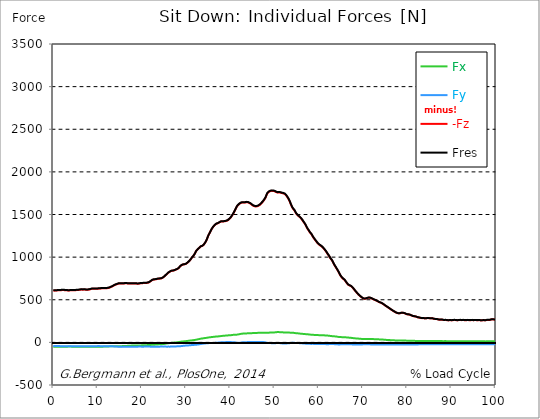
| Category |  Fx |  Fy |  -Fz |  Fres |
|---|---|---|---|---|
| 0.0 | -50.03 | -43.73 | 606.7 | 610.42 |
| 0.167348456675344 | -50.14 | -43.71 | 606.81 | 610.54 |
| 0.334696913350688 | -50.29 | -43.69 | 607.09 | 610.83 |
| 0.5020453700260321 | -50.26 | -43.76 | 607.5 | 611.24 |
| 0.669393826701376 | -50 | -43.91 | 607.67 | 611.4 |
| 0.83674228337672 | -50 | -43.82 | 608.8 | 612.51 |
| 1.0040907400520642 | -50.16 | -43.66 | 610.52 | 614.22 |
| 1.1621420602454444 | -50.29 | -43.71 | 611.02 | 614.73 |
| 1.3294905169207885 | -50.4 | -43.79 | 611.34 | 615.07 |
| 1.4968389735961325 | -50.25 | -43.98 | 611.24 | 614.97 |
| 1.6641874302714765 | -50.2 | -44.18 | 611.58 | 615.32 |
| 1.8315358869468206 | -50.31 | -44.32 | 612.5 | 616.26 |
| 1.9988843436221646 | -50.57 | -44.38 | 613.5 | 617.27 |
| 2.1662328002975086 | -50.65 | -44.38 | 613.83 | 617.61 |
| 2.333581256972853 | -50.66 | -44.45 | 613.87 | 617.65 |
| 2.5009297136481967 | -50.94 | -44.41 | 613.16 | 616.96 |
| 2.6682781703235405 | -50.64 | -44.63 | 610.94 | 614.74 |
| 2.8356266269988843 | -50.2 | -44.5 | 610.81 | 614.57 |
| 3.002975083674229 | -50.25 | -44.3 | 610.69 | 614.44 |
| 3.1703235403495724 | -50.28 | -44.38 | 609.22 | 612.99 |
| 3.337671997024917 | -49.77 | -44.44 | 608.58 | 612.32 |
| 3.4957233172182973 | -49.54 | -44.42 | 608.79 | 612.5 |
| 3.663071773893641 | -49.49 | -44.37 | 609.25 | 612.95 |
| 3.8304202305689854 | -49.52 | -44.34 | 610.05 | 613.75 |
| 3.997768687244329 | -49.82 | -44.34 | 611.59 | 615.3 |
| 4.165117143919673 | -50.29 | -44.34 | 611.83 | 615.57 |
| 4.332465600595017 | -50.3 | -44.55 | 611.91 | 615.67 |
| 4.499814057270361 | -50.46 | -44.6 | 612.08 | 615.85 |
| 4.667162513945706 | -50.46 | -44.63 | 611.01 | 614.8 |
| 4.834510970621049 | -50.18 | -44.73 | 610.04 | 613.82 |
| 5.001859427296393 | -50 | -44.64 | 611.25 | 615 |
| 5.169207883971737 | -50.35 | -44.39 | 613.1 | 616.84 |
| 5.336556340647081 | -50.72 | -44.33 | 614.27 | 618.04 |
| 5.503904797322425 | -51.13 | -44.53 | 614.47 | 618.28 |
| 5.671253253997769 | -50.86 | -44.63 | 614.72 | 618.51 |
| 5.82930457419115 | -50.81 | -44.65 | 615.88 | 619.66 |
| 5.996653030866494 | -50.98 | -44.63 | 617.39 | 621.17 |
| 6.164001487541838 | -51.19 | -44.56 | 618.68 | 622.47 |
| 6.331349944217181 | -51.36 | -44.56 | 619.37 | 623.17 |
| 6.498698400892526 | -51.21 | -44.72 | 619.13 | 622.93 |
| 6.66604685756787 | -50.77 | -45.04 | 618.05 | 621.85 |
| 6.833395314243213 | -50.56 | -45.03 | 619.19 | 622.96 |
| 7.000743770918558 | -51.36 | -44.94 | 619.77 | 623.6 |
| 7.168092227593902 | -51.63 | -44.89 | 618.61 | 622.46 |
| 7.335440684269246 | -51.53 | -44.88 | 617.51 | 621.37 |
| 7.50278914094459 | -51.17 | -44.82 | 616.87 | 620.69 |
| 7.6701375976199335 | -51.35 | -44.64 | 616.97 | 620.78 |
| 7.837486054295278 | -51.47 | -44.79 | 617.33 | 621.16 |
| 7.995537374488658 | -51.59 | -44.84 | 618.77 | 622.61 |
| 8.162885831164003 | -52.3 | -44.68 | 621.01 | 624.88 |
| 8.330234287839346 | -52.4 | -44.66 | 622.7 | 626.57 |
| 8.49758274451469 | -52.33 | -44.54 | 624.35 | 628.2 |
| 8.664931201190035 | -52.21 | -44.27 | 627.65 | 631.45 |
| 8.832279657865378 | -52.04 | -44.27 | 628.22 | 631.99 |
| 8.999628114540721 | -51.46 | -44.2 | 628.36 | 632.09 |
| 9.166976571216066 | -51.82 | -44.13 | 629.01 | 632.76 |
| 9.334325027891412 | -51.57 | -44.18 | 628.21 | 631.95 |
| 9.501673484566755 | -51.21 | -44.17 | 628.23 | 631.94 |
| 9.669021941242098 | -51.06 | -44.13 | 628.77 | 632.47 |
| 9.836370397917442 | -51.72 | -43.76 | 630.57 | 634.29 |
| 10.003718854592787 | -51.32 | -43.96 | 629.32 | 633.03 |
| 10.17106731126813 | -50.98 | -43.87 | 630 | 633.68 |
| 10.329118631461512 | -50.83 | -43.89 | 631.03 | 634.69 |
| 10.496467088136853 | -51.18 | -43.97 | 632.4 | 636.1 |
| 10.663815544812199 | -50.75 | -44.24 | 632.56 | 636.25 |
| 10.831164001487544 | -50.8 | -44.48 | 633.72 | 637.43 |
| 10.998512458162887 | -50.89 | -44.59 | 634.09 | 637.82 |
| 11.16586091483823 | -50.25 | -44.62 | 634.28 | 637.95 |
| 11.333209371513574 | -49.75 | -44.71 | 633.45 | 637.1 |
| 11.50055782818892 | -48.91 | -44.7 | 633.4 | 637 |
| 11.667906284864264 | -48.38 | -44.69 | 633.43 | 636.99 |
| 11.835254741539607 | -47.92 | -44.75 | 633.3 | 636.83 |
| 12.00260319821495 | -47.85 | -44.9 | 634.76 | 638.31 |
| 12.169951654890292 | -47.43 | -45.13 | 635.64 | 639.16 |
| 12.337300111565641 | -47.79 | -45.23 | 637.43 | 640.98 |
| 12.504648568240984 | -47.06 | -45.49 | 638.25 | 641.77 |
| 12.662699888434362 | -46.84 | -45.68 | 641.33 | 644.84 |
| 12.830048345109708 | -46.6 | -45.93 | 644.88 | 648.39 |
| 12.997396801785053 | -46.11 | -46.07 | 649.49 | 652.97 |
| 13.164745258460396 | -46.09 | -46.11 | 653.83 | 657.31 |
| 13.33209371513574 | -45.84 | -46.42 | 656.97 | 660.46 |
| 13.499442171811083 | -45.76 | -46.72 | 661.44 | 664.94 |
| 13.666790628486426 | -46.01 | -47.05 | 667.28 | 670.81 |
| 13.834139085161771 | -45.85 | -47.48 | 672.17 | 675.71 |
| 14.001487541837117 | -45.58 | -47.71 | 675.96 | 679.5 |
| 14.16883599851246 | -45.53 | -48.23 | 679 | 682.55 |
| 14.336184455187803 | -45.29 | -49.05 | 681.45 | 685.01 |
| 14.503532911863147 | -45.06 | -49.79 | 684.89 | 688.46 |
| 14.670881368538492 | -44.8 | -50.48 | 688.56 | 692.15 |
| 14.828932688731873 | -44.61 | -50.66 | 690.56 | 694.14 |
| 14.996281145407215 | -44.37 | -50.83 | 690.69 | 694.26 |
| 15.163629602082558 | -43.97 | -50.82 | 690.68 | 694.22 |
| 15.330978058757903 | -44.33 | -50.81 | 691.21 | 694.78 |
| 15.498326515433247 | -44.28 | -50.85 | 691.18 | 694.76 |
| 15.665674972108594 | -43.83 | -51.06 | 690.93 | 694.5 |
| 15.833023428783937 | -43.39 | -51.31 | 690.98 | 694.54 |
| 16.00037188545928 | -42.86 | -51.4 | 691.07 | 694.6 |
| 16.167720342134626 | -42.68 | -51.51 | 692.37 | 695.89 |
| 16.335068798809967 | -42.73 | -51.37 | 693.41 | 696.91 |
| 16.502417255485312 | -42.02 | -51.28 | 692.83 | 696.28 |
| 16.669765712160658 | -41.21 | -51.13 | 691.95 | 695.34 |
| 16.837114168836 | -40.26 | -50.86 | 690.62 | 693.95 |
| 17.004462625511344 | -39.67 | -50.69 | 689.55 | 692.84 |
| 17.16251394570472 | -39.1 | -50.52 | 688.62 | 691.88 |
| 17.32986240238007 | -38.62 | -50.21 | 689.46 | 692.68 |
| 17.497210859055414 | -38.38 | -50.07 | 689.43 | 692.65 |
| 17.664559315730756 | -38.1 | -50.08 | 689.35 | 692.55 |
| 17.8319077724061 | -38.3 | -50.09 | 690.65 | 693.87 |
| 17.999256229081443 | -38.13 | -50.06 | 691.11 | 694.32 |
| 18.166604685756788 | -37.95 | -49.92 | 691.1 | 694.3 |
| 18.333953142432133 | -37.44 | -49.96 | 690.66 | 693.84 |
| 18.501301599107478 | -37.17 | -50.11 | 690.75 | 693.92 |
| 18.668650055782823 | -37.32 | -49.99 | 690.06 | 693.25 |
| 18.835998512458165 | -36.9 | -50.12 | 688.65 | 691.83 |
| 19.00334696913351 | -36.75 | -50.07 | 688.29 | 691.46 |
| 19.170695425808855 | -36.61 | -50 | 688.05 | 691.21 |
| 19.338043882484197 | -36.16 | -49.74 | 689.17 | 692.29 |
| 19.496095202677576 | -35.95 | -49.45 | 690.96 | 694.05 |
| 19.66344365935292 | -35.72 | -49.39 | 692.54 | 695.62 |
| 19.830792116028263 | -35.12 | -49.92 | 692.88 | 695.96 |
| 19.998140572703612 | -34.98 | -50.15 | 694.28 | 697.35 |
| 20.165489029378953 | -34.74 | -50.04 | 695.34 | 698.4 |
| 20.3328374860543 | -34.53 | -49.96 | 695.11 | 698.15 |
| 20.500185942729644 | -34.13 | -49.87 | 694.75 | 697.77 |
| 20.667534399404985 | -33.5 | -49.74 | 694.98 | 697.95 |
| 20.83488285608033 | -32.97 | -49.7 | 696.65 | 699.6 |
| 21.002231312755672 | -32.68 | -49.73 | 696.59 | 699.54 |
| 21.16957976943102 | -32.07 | -49.63 | 697.96 | 700.86 |
| 21.336928226106362 | -31.84 | -49.48 | 699.69 | 702.57 |
| 21.504276682781704 | -31.51 | -49.44 | 701.53 | 704.39 |
| 21.67162513945705 | -31.05 | -49.57 | 705.58 | 708.41 |
| 21.82967645965043 | -30.59 | -49.63 | 710.68 | 713.48 |
| 21.997024916325774 | -29.94 | -50.21 | 718.14 | 720.92 |
| 22.16437337300112 | -29.32 | -50.72 | 725.43 | 728.2 |
| 22.33172182967646 | -28.55 | -50.78 | 730.93 | 733.67 |
| 22.499070286351806 | -27.82 | -50.57 | 734.25 | 736.95 |
| 22.666418743027148 | -27.14 | -50.49 | 736.87 | 739.53 |
| 22.833767199702496 | -26.76 | -50.59 | 738.41 | 741.05 |
| 23.00111565637784 | -26.46 | -50.6 | 739.01 | 741.62 |
| 23.168464113053183 | -25.8 | -50.65 | 739.18 | 741.75 |
| 23.335812569728528 | -25.26 | -50.63 | 741.61 | 744.15 |
| 23.50316102640387 | -24.48 | -50.53 | 745.12 | 747.62 |
| 23.670509483079215 | -23.78 | -50.4 | 747.04 | 749.5 |
| 23.83785793975456 | -23.07 | -50.35 | 748.05 | 750.47 |
| 23.995909259947936 | -22.47 | -50.1 | 748.03 | 750.39 |
| 24.163257716623285 | -22.05 | -49.56 | 747.69 | 749.99 |
| 24.330606173298627 | -21.54 | -49.38 | 749.4 | 751.67 |
| 24.49795462997397 | -20.86 | -49.14 | 752.52 | 754.76 |
| 24.665303086649313 | -20.34 | -49.5 | 757.07 | 759.31 |
| 24.83265154332466 | -19.49 | -49.79 | 762.71 | 764.95 |
| 25.0 | -18.4 | -49.91 | 768.77 | 770.98 |
| 25.167348456675345 | -16.95 | -49.71 | 776.84 | 779.03 |
| 25.334696913350694 | -15.35 | -49.36 | 785.76 | 787.93 |
| 25.502045370026035 | -14.36 | -49.82 | 793.87 | 796.05 |
| 25.669393826701377 | -12.76 | -50.24 | 801.05 | 803.24 |
| 25.836742283376722 | -11.12 | -49.69 | 809.87 | 812.06 |
| 26.004090740052067 | -10.08 | -49.69 | 817.6 | 819.8 |
| 26.17143919672741 | -9.38 | -50.09 | 823.62 | 825.83 |
| 26.329490516920792 | -8.33 | -50.05 | 828.77 | 830.96 |
| 26.49683897359613 | -7.05 | -49.66 | 834.05 | 836.21 |
| 26.66418743027148 | -5.98 | -49.2 | 838.92 | 841.07 |
| 26.831535886946828 | -5.4 | -49.2 | 839.9 | 842.02 |
| 26.998884343622166 | -4.6 | -48.91 | 840.66 | 842.72 |
| 27.166232800297514 | -3.75 | -48.61 | 841.61 | 843.62 |
| 27.333581256972852 | -2.51 | -47.91 | 845.4 | 847.37 |
| 27.5009297136482 | -1.61 | -47.61 | 849.03 | 850.97 |
| 27.668278170323543 | -0.83 | -47.37 | 852.81 | 854.72 |
| 27.835626626998888 | -0.17 | -47.35 | 856.7 | 858.59 |
| 28.002975083674233 | 0.77 | -46.47 | 860.36 | 862.19 |
| 28.170323540349575 | 1.85 | -45.81 | 864.91 | 866.69 |
| 28.33767199702492 | 3.05 | -44.99 | 871.39 | 873.12 |
| 28.50502045370026 | 4.9 | -44.93 | 883.01 | 884.76 |
| 28.663071773893645 | 6.69 | -45.29 | 892.73 | 894.53 |
| 28.830420230568986 | 8.22 | -44.26 | 900.25 | 902.05 |
| 28.99776868724433 | 9.47 | -42.87 | 906.32 | 908.1 |
| 29.165117143919673 | 10.29 | -41.83 | 910 | 911.74 |
| 29.33246560059502 | 11.11 | -40.8 | 913.54 | 915.23 |
| 29.499814057270367 | 11.94 | -39.96 | 915.54 | 917.21 |
| 29.66716251394571 | 12.93 | -39.09 | 916.25 | 917.89 |
| 29.834510970621054 | 14.06 | -37.9 | 917.73 | 919.32 |
| 30.00185942729639 | 14.99 | -37.08 | 922.27 | 923.82 |
| 30.169207883971744 | 16.03 | -36.43 | 928.11 | 929.66 |
| 30.33655634064708 | 17.24 | -36.08 | 935.2 | 936.75 |
| 30.50390479732243 | 18.4 | -35.56 | 942.12 | 943.66 |
| 30.671253253997772 | 19.41 | -35.08 | 950.84 | 952.37 |
| 30.829304574191156 | 20.87 | -33.97 | 959.71 | 961.21 |
| 30.996653030866494 | 21.99 | -32.74 | 970.44 | 971.91 |
| 31.164001487541842 | 22.64 | -32.25 | 983.08 | 984.54 |
| 31.331349944217187 | 23.64 | -31.68 | 995.01 | 996.44 |
| 31.498698400892525 | 24.94 | -31.19 | 1005.84 | 1007.24 |
| 31.666046857567874 | 25.91 | -30.09 | 1014.98 | 1016.32 |
| 31.833395314243212 | 27.01 | -29.1 | 1025.86 | 1027.15 |
| 32.00074377091856 | 28.48 | -28.49 | 1041.4 | 1042.69 |
| 32.1680922275939 | 30.18 | -27.96 | 1059.26 | 1060.59 |
| 32.33544068426925 | 31.85 | -27.06 | 1074.95 | 1076.31 |
| 32.50278914094459 | 33.51 | -25.9 | 1085.31 | 1086.65 |
| 32.670137597619934 | 35.58 | -24.96 | 1093.42 | 1094.75 |
| 32.83748605429528 | 37.87 | -24.48 | 1101.66 | 1103.01 |
| 33.004834510970625 | 39.69 | -22.5 | 1109.67 | 1110.98 |
| 33.162885831164004 | 41.44 | -20.27 | 1117.64 | 1118.91 |
| 33.33023428783935 | 43.37 | -19.17 | 1126.08 | 1127.36 |
| 33.497582744514695 | 44.7 | -17.82 | 1129.32 | 1130.64 |
| 33.664931201190036 | 45.88 | -16.27 | 1132.04 | 1133.38 |
| 33.83227965786538 | 47.24 | -14.88 | 1136.57 | 1137.96 |
| 33.99962811454073 | 48.73 | -14.39 | 1145.59 | 1147.06 |
| 34.16697657121607 | 49.96 | -13.6 | 1158.16 | 1159.67 |
| 34.33432502789141 | 51.27 | -12.25 | 1170.76 | 1172.28 |
| 34.50167348456676 | 52.45 | -11.24 | 1185.78 | 1187.31 |
| 34.6690219412421 | 53.47 | -10.48 | 1203.43 | 1204.98 |
| 34.83637039791744 | 54.89 | -9.75 | 1225.67 | 1227.27 |
| 35.00371885459279 | 56.7 | -9.27 | 1248.28 | 1249.94 |
| 35.17106731126814 | 58.15 | -8.69 | 1265.86 | 1267.54 |
| 35.338415767943474 | 59.25 | -8.21 | 1282.45 | 1284.16 |
| 35.49646708813686 | 60.4 | -8.12 | 1299.5 | 1301.25 |
| 35.6638155448122 | 61.6 | -8.29 | 1316.74 | 1318.53 |
| 35.831164001487544 | 62.29 | -8.17 | 1332.68 | 1334.48 |
| 35.998512458162885 | 63.43 | -7.93 | 1345.62 | 1347.48 |
| 36.165860914838234 | 64.66 | -7.29 | 1357.4 | 1359.3 |
| 36.333209371513576 | 65.71 | -6.92 | 1367.85 | 1369.8 |
| 36.50055782818892 | 67.04 | -6.21 | 1376.92 | 1378.94 |
| 36.667906284864266 | 67.66 | -5.39 | 1384.26 | 1386.31 |
| 36.83525474153961 | 68.19 | -4.48 | 1390.79 | 1392.86 |
| 37.002603198214956 | 68.89 | -3.69 | 1394.28 | 1396.4 |
| 37.1699516548903 | 69.73 | -3.03 | 1396.84 | 1399.01 |
| 37.337300111565646 | 70.47 | -2.4 | 1400.95 | 1403.16 |
| 37.50464856824098 | 71.39 | -1.71 | 1406.62 | 1408.88 |
| 37.66269988843437 | 72.5 | -0.87 | 1412.49 | 1414.82 |
| 37.83004834510971 | 73.63 | -0.05 | 1416.71 | 1419.12 |
| 37.99739680178505 | 74.76 | 0.76 | 1419.02 | 1421.51 |
| 38.16474525846039 | 75.78 | 1.5 | 1419.33 | 1421.9 |
| 38.33209371513574 | 76.7 | 1.75 | 1419.24 | 1421.88 |
| 38.49944217181109 | 77.62 | 2.01 | 1419.15 | 1421.86 |
| 38.666790628486424 | 78.35 | 2.26 | 1420.67 | 1423.44 |
| 38.83413908516178 | 79.09 | 2.75 | 1421.81 | 1424.64 |
| 39.001487541837115 | 79.86 | 3.19 | 1423.38 | 1426.28 |
| 39.16883599851246 | 80.73 | 3.45 | 1426.29 | 1429.25 |
| 39.336184455187805 | 81.58 | 3.75 | 1429.42 | 1432.45 |
| 39.503532911863154 | 82.12 | 3.79 | 1434.83 | 1437.91 |
| 39.670881368538495 | 82.54 | 3.6 | 1442.44 | 1445.55 |
| 39.83822982521384 | 83.14 | 3.8 | 1450.51 | 1453.67 |
| 39.996281145407224 | 83.67 | 3.78 | 1458.89 | 1462.09 |
| 40.163629602082565 | 84.41 | 3.52 | 1469.05 | 1472.3 |
| 40.33097805875791 | 85.53 | 2.81 | 1482.54 | 1485.86 |
| 40.498326515433256 | 86.98 | 2.87 | 1496.13 | 1499.52 |
| 40.6656749721086 | 88.43 | 2.24 | 1509.4 | 1512.86 |
| 40.83302342878393 | 88.67 | 1.19 | 1525.85 | 1529.31 |
| 41.00037188545929 | 89.02 | -0.08 | 1541.85 | 1545.32 |
| 41.16772034213463 | 89.33 | -1.76 | 1558.95 | 1562.45 |
| 41.33506879880997 | 89.72 | -3.58 | 1576.72 | 1580.25 |
| 41.50241725548531 | 90.83 | -5.14 | 1593.8 | 1597.38 |
| 41.66976571216066 | 91.65 | -5.57 | 1605.57 | 1609.18 |
| 41.837114168836 | 93.46 | -5.3 | 1614.19 | 1617.94 |
| 42.004462625511344 | 95.38 | -5.16 | 1622.28 | 1626.18 |
| 42.17181108218669 | 97.44 | -4.64 | 1628.85 | 1632.92 |
| 42.32986240238007 | 99.37 | -3.59 | 1634.57 | 1638.8 |
| 42.497210859055414 | 100.63 | -1.89 | 1638.27 | 1642.59 |
| 42.66455931573076 | 101.62 | -0.33 | 1640.05 | 1644.5 |
| 42.831907772406105 | 103.46 | 0.26 | 1640.85 | 1645.53 |
| 42.999256229081446 | 104.35 | 1.8 | 1639.27 | 1644.07 |
| 43.16660468575679 | 104.73 | 2.94 | 1638.53 | 1643.38 |
| 43.33395314243214 | 105.08 | 2.6 | 1639.78 | 1644.65 |
| 43.50130159910748 | 105.17 | 2.73 | 1641.9 | 1646.73 |
| 43.66865005578282 | 105.24 | 2.75 | 1643.57 | 1648.38 |
| 43.83599851245817 | 105.47 | 2.75 | 1643.81 | 1648.63 |
| 44.00334696913351 | 106.17 | 3.27 | 1642.14 | 1647.03 |
| 44.17069542580886 | 107.15 | 3.98 | 1638.64 | 1643.61 |
| 44.3380438824842 | 107.86 | 3.68 | 1633.98 | 1638.98 |
| 44.49609520267758 | 107.42 | 3.39 | 1629.16 | 1634.08 |
| 44.66344365935292 | 106.77 | 3.21 | 1623.97 | 1628.82 |
| 44.83079211602827 | 107.65 | 2.78 | 1617.17 | 1622.13 |
| 44.99814057270361 | 108.64 | 3.54 | 1609.21 | 1614.24 |
| 45.16548902937895 | 109.27 | 4.2 | 1603.08 | 1608.15 |
| 45.332837486054295 | 109.8 | 4.52 | 1599.13 | 1604.25 |
| 45.500185942729644 | 110.77 | 4.02 | 1596.1 | 1601.31 |
| 45.66753439940499 | 111.19 | 3.44 | 1594.51 | 1599.76 |
| 45.83488285608033 | 111.15 | 3.6 | 1594.36 | 1599.63 |
| 46.00223131275568 | 111 | 4.14 | 1595.45 | 1600.73 |
| 46.16957976943102 | 111.18 | 4.74 | 1598.06 | 1603.36 |
| 46.336928226106366 | 111.79 | 5.26 | 1601.63 | 1606.99 |
| 46.50427668278171 | 112.29 | 5.78 | 1606.19 | 1611.61 |
| 46.671625139457056 | 111.87 | 5.44 | 1612.73 | 1618.09 |
| 46.829676459650436 | 112.17 | 5.38 | 1621.03 | 1626.38 |
| 46.99702491632577 | 112.61 | 5.35 | 1629.68 | 1635.05 |
| 47.16437337300112 | 113.35 | 5.17 | 1639.35 | 1644.74 |
| 47.33172182967646 | 112.84 | 4.47 | 1648.5 | 1653.77 |
| 47.49907028635181 | 112.26 | 3.29 | 1660.13 | 1665.27 |
| 47.66641874302716 | 111.97 | 2.19 | 1671.35 | 1676.42 |
| 47.83376719970249 | 111.81 | 1.63 | 1682.35 | 1687.36 |
| 48.001115656377834 | 111.63 | -0.49 | 1700.26 | 1705.22 |
| 48.16846411305319 | 111.44 | -3.31 | 1723.63 | 1728.52 |
| 48.33581256972853 | 112.23 | -5.26 | 1744.91 | 1749.81 |
| 48.50316102640387 | 113.26 | -6.45 | 1756.04 | 1760.96 |
| 48.67050948307921 | 113.65 | -7.06 | 1763.65 | 1768.57 |
| 48.837857939754564 | 114.2 | -7.44 | 1769.75 | 1774.7 |
| 49.005206396429905 | 114.98 | -7.82 | 1773.27 | 1778.24 |
| 49.163257716623285 | 115.24 | -8.56 | 1775.87 | 1780.87 |
| 49.33060617329863 | 115.68 | -9.44 | 1777.49 | 1782.54 |
| 49.49795462997397 | 116.32 | -10.38 | 1777.96 | 1783.08 |
| 49.66530308664932 | 116.99 | -10.94 | 1776.62 | 1781.79 |
| 49.832651543324666 | 116.96 | -11.48 | 1775.39 | 1780.55 |
| 50.0 | 116.81 | -11.54 | 1773.54 | 1778.69 |
| 50.16734845667534 | 118.2 | -9.93 | 1769.42 | 1774.66 |
| 50.33469691335069 | 119.22 | -8.93 | 1764.3 | 1769.62 |
| 50.50204537002604 | 120.25 | -7.92 | 1759.19 | 1764.58 |
| 50.66939382670139 | 120.78 | -6.58 | 1756.81 | 1762.22 |
| 50.836742283376715 | 120.67 | -7.17 | 1757.65 | 1763.03 |
| 51.00409074005207 | 120.54 | -7.82 | 1758.58 | 1763.94 |
| 51.17143919672741 | 120.34 | -8.91 | 1758.78 | 1764.12 |
| 51.32949051692079 | 119.38 | -9.49 | 1756.77 | 1762.05 |
| 51.496838973596134 | 116.75 | -9.51 | 1754.49 | 1759.58 |
| 51.66418743027148 | 117.54 | -11.8 | 1751 | 1756.17 |
| 51.831535886946824 | 117.79 | -13.32 | 1748.8 | 1754.02 |
| 51.99888434362217 | 117.22 | -13.24 | 1747.92 | 1753.09 |
| 52.16623280029752 | 116.66 | -13.03 | 1746.93 | 1752.06 |
| 52.33358125697285 | 116.46 | -13.25 | 1740.69 | 1745.82 |
| 52.5009297136482 | 116.14 | -13.16 | 1732.3 | 1737.43 |
| 52.668278170323546 | 116.18 | -12.38 | 1722.2 | 1727.35 |
| 52.835626626998895 | 116.16 | -11.88 | 1709.86 | 1715.02 |
| 53.00297508367424 | 115.88 | -11.44 | 1696.61 | 1701.78 |
| 53.17032354034958 | 115.37 | -11.06 | 1682.2 | 1687.37 |
| 53.33767199702492 | 114.9 | -10.19 | 1665.33 | 1670.51 |
| 53.50502045370027 | 114.54 | -8.45 | 1645.6 | 1650.77 |
| 53.663071773893655 | 113.51 | -7.15 | 1622.96 | 1628.07 |
| 53.83042023056899 | 112.45 | -6.52 | 1603.07 | 1608.12 |
| 53.99776868724433 | 112.45 | -5.09 | 1584.61 | 1589.69 |
| 54.16511714391967 | 112.43 | -4.3 | 1569.45 | 1574.58 |
| 54.33246560059503 | 111.67 | -4.96 | 1559.01 | 1564.12 |
| 54.49981405727037 | 110.31 | -5.56 | 1549.12 | 1554.15 |
| 54.667162513945705 | 108.91 | -5.95 | 1533.26 | 1538.23 |
| 54.834510970621054 | 107.57 | -6.38 | 1517.52 | 1522.43 |
| 55.0018594272964 | 106.9 | -7.15 | 1504.55 | 1509.43 |
| 55.169207883971744 | 106.69 | -7.42 | 1494.29 | 1499.17 |
| 55.336556340647086 | 105.88 | -8.02 | 1486.26 | 1491.08 |
| 55.50390479732243 | 104.74 | -8.59 | 1479.2 | 1483.92 |
| 55.671253253997776 | 103.59 | -9.15 | 1472.15 | 1476.76 |
| 55.83860171067312 | 102.5 | -9.79 | 1464.1 | 1468.62 |
| 55.9966530308665 | 101.46 | -10.54 | 1454.81 | 1459.27 |
| 56.16400148754184 | 100.59 | -11.26 | 1444.51 | 1448.92 |
| 56.33134994421718 | 99.89 | -11.86 | 1431.91 | 1436.32 |
| 56.498698400892536 | 99.27 | -12.38 | 1418.54 | 1422.93 |
| 56.66604685756788 | 98.75 | -13.44 | 1406.91 | 1411.29 |
| 56.83339531424321 | 97.81 | -14.13 | 1393.66 | 1398.03 |
| 57.00074377091856 | 96.84 | -14.88 | 1379.58 | 1383.92 |
| 57.16809222759391 | 96.03 | -15.24 | 1361.93 | 1366.27 |
| 57.33544068426925 | 95.24 | -15.18 | 1344.84 | 1349.17 |
| 57.5027891409446 | 94.42 | -15.45 | 1329.82 | 1334.14 |
| 57.670137597619934 | 93.75 | -16.11 | 1319.19 | 1323.49 |
| 57.83748605429528 | 92.46 | -16.51 | 1304.48 | 1308.72 |
| 58.004834510970625 | 91.16 | -17.5 | 1290.21 | 1294.41 |
| 58.16288583116401 | 90.8 | -17.56 | 1278.61 | 1282.83 |
| 58.330234287839346 | 90.39 | -17.78 | 1269.89 | 1274.1 |
| 58.497582744514695 | 89.68 | -17.44 | 1256.41 | 1260.6 |
| 58.66493120119004 | 88.69 | -17.42 | 1240.05 | 1244.21 |
| 58.832279657865385 | 88.01 | -17.97 | 1226.93 | 1231.09 |
| 58.999628114540734 | 87.48 | -18.36 | 1215.01 | 1219.19 |
| 59.16697657121607 | 86.97 | -18.43 | 1203.13 | 1207.33 |
| 59.33432502789142 | 86.7 | -18.32 | 1192.29 | 1196.52 |
| 59.50167348456676 | 86.2 | -18.76 | 1180.57 | 1184.82 |
| 59.66902194124211 | 85.67 | -19.4 | 1168.41 | 1172.67 |
| 59.83637039791745 | 85.38 | -19.55 | 1159.39 | 1163.67 |
| 60.00371885459278 | 84.86 | -19.54 | 1150.76 | 1155.04 |
| 60.17106731126813 | 84.62 | -19.99 | 1143.6 | 1147.9 |
| 60.33841576794349 | 84.49 | -19.93 | 1137.69 | 1141.99 |
| 60.49646708813685 | 84.36 | -19.87 | 1131.78 | 1136.08 |
| 60.6638155448122 | 84.2 | -19.82 | 1125.71 | 1130.02 |
| 60.831164001487544 | 83.72 | -20.03 | 1117.23 | 1121.53 |
| 60.99851245816289 | 83.23 | -20.25 | 1108.74 | 1113.04 |
| 61.16586091483824 | 82.67 | -20.37 | 1098.87 | 1103.16 |
| 61.333209371513576 | 82.06 | -20.43 | 1088.11 | 1092.4 |
| 61.50055782818892 | 81.14 | -20.11 | 1078.56 | 1082.81 |
| 61.667906284864266 | 80.32 | -20.6 | 1064.99 | 1069.22 |
| 61.835254741539615 | 79.69 | -20.69 | 1052.39 | 1056.6 |
| 62.002603198214956 | 79.73 | -21.14 | 1038.04 | 1042.29 |
| 62.16995165489029 | 78.85 | -21.13 | 1026.58 | 1030.8 |
| 62.33730011156564 | 77.67 | -20.46 | 1013.09 | 1017.26 |
| 62.504648568240995 | 76.28 | -20.04 | 998.67 | 1002.76 |
| 62.67199702491633 | 75.43 | -19.89 | 983.54 | 987.59 |
| 62.83004834510971 | 74.96 | -20.84 | 972.6 | 976.68 |
| 62.99739680178505 | 73.09 | -20 | 962.56 | 966.48 |
| 63.1647452584604 | 71.6 | -20.13 | 946.28 | 950.08 |
| 63.33209371513575 | 71.27 | -20.01 | 928.3 | 932.04 |
| 63.4994421718111 | 70.87 | -20.14 | 911.3 | 915 |
| 63.666790628486424 | 70.25 | -21 | 897.14 | 900.83 |
| 63.83413908516177 | 69.57 | -21.13 | 883.58 | 887.25 |
| 64.00148754183712 | 68.48 | -21.77 | 868.88 | 872.5 |
| 64.16883599851248 | 66.83 | -22.68 | 855.48 | 859.02 |
| 64.3361844551878 | 64.95 | -23.7 | 840.26 | 843.71 |
| 64.50353291186315 | 63.65 | -24.27 | 824.75 | 828.17 |
| 64.6708813685385 | 63.06 | -24.32 | 808.14 | 811.56 |
| 64.83822982521384 | 62.74 | -23.45 | 790.47 | 793.87 |
| 65.00557828188919 | 62.1 | -22.66 | 777.04 | 780.41 |
| 65.16362960208257 | 61.39 | -21.8 | 765.15 | 768.49 |
| 65.3309780587579 | 60.75 | -20.76 | 755.04 | 758.35 |
| 65.49832651543326 | 60.75 | -20.58 | 746.81 | 750.14 |
| 65.6656749721086 | 61.36 | -20.85 | 740.27 | 743.7 |
| 65.83302342878395 | 61.97 | -21.12 | 733.72 | 737.25 |
| 66.00037188545929 | 60.25 | -22.13 | 722.22 | 725.65 |
| 66.16772034213463 | 58.87 | -22.39 | 709.37 | 712.73 |
| 66.33506879880998 | 57.77 | -22.3 | 696.99 | 700.28 |
| 66.50241725548531 | 56.98 | -22.15 | 685.44 | 688.69 |
| 66.66976571216065 | 56.52 | -21.81 | 676.08 | 679.32 |
| 66.83711416883601 | 54.81 | -21.04 | 671.1 | 674.17 |
| 67.00446262551135 | 54.56 | -21.46 | 667.13 | 670.19 |
| 67.1718110821867 | 53.9 | -22.15 | 663.64 | 666.68 |
| 67.32986240238007 | 53.1 | -22.83 | 659 | 662.01 |
| 67.49721085905541 | 52.06 | -23.51 | 652.31 | 655.29 |
| 67.66455931573076 | 50.95 | -23.87 | 643.08 | 646 |
| 67.83190777240611 | 49.64 | -24.1 | 632.55 | 635.4 |
| 67.99925622908145 | 48.47 | -24.12 | 621.27 | 624.03 |
| 68.16660468575678 | 47.53 | -24.13 | 610.1 | 612.81 |
| 68.33395314243214 | 46.7 | -24.23 | 599.56 | 602.25 |
| 68.50130159910749 | 46.03 | -24.38 | 589.77 | 592.44 |
| 68.66865005578282 | 45.38 | -24.34 | 579.32 | 581.97 |
| 68.83599851245816 | 44.76 | -24.03 | 569.51 | 572.13 |
| 69.00334696913352 | 44.03 | -23.88 | 560.18 | 562.78 |
| 69.17069542580886 | 43.1 | -24.05 | 551.62 | 554.2 |
| 69.3380438824842 | 42.43 | -23.91 | 544.01 | 546.56 |
| 69.50539233915956 | 41.6 | -24.19 | 537.18 | 539.68 |
| 69.66344365935292 | 40.7 | -23.95 | 529.65 | 532.11 |
| 69.83079211602826 | 39.75 | -23.61 | 523.14 | 525.53 |
| 69.99814057270362 | 38.92 | -23.46 | 517.55 | 519.89 |
| 70.16548902937896 | 38.33 | -23.38 | 513.24 | 515.55 |
| 70.33283748605429 | 38.24 | -22.96 | 511.53 | 513.85 |
| 70.50018594272964 | 38.21 | -22.6 | 510.36 | 512.68 |
| 70.667534399405 | 38.77 | -22.62 | 514.13 | 516.48 |
| 70.83488285608033 | 39.36 | -22.45 | 517.67 | 520.05 |
| 71.00223131275568 | 40 | -22.19 | 520.81 | 523.23 |
| 71.16957976943102 | 40.61 | -22.03 | 523.89 | 526.35 |
| 71.33692822610637 | 40.8 | -22.36 | 524.16 | 526.65 |
| 71.50427668278171 | 40.96 | -22.76 | 524.08 | 526.59 |
| 71.67162513945706 | 40.96 | -23.55 | 522 | 524.53 |
| 71.8389735961324 | 40.69 | -24.09 | 519.15 | 521.67 |
| 71.99702491632577 | 39.89 | -24.15 | 514.81 | 517.27 |
| 72.16437337300113 | 39.09 | -24.21 | 510.47 | 512.86 |
| 72.33172182967647 | 38.39 | -24.68 | 506.16 | 508.52 |
| 72.49907028635181 | 37.81 | -25.27 | 501.99 | 504.33 |
| 72.66641874302715 | 37.67 | -25.47 | 498.64 | 500.99 |
| 72.8337671997025 | 37.29 | -25.55 | 494.79 | 497.13 |
| 73.00111565637783 | 36.91 | -25.63 | 490.92 | 493.24 |
| 73.16846411305319 | 36.61 | -25.51 | 486.71 | 489.02 |
| 73.33581256972853 | 36.19 | -25.39 | 481.95 | 484.24 |
| 73.50316102640387 | 35.41 | -25.52 | 476.43 | 478.68 |
| 73.67050948307921 | 34.99 | -25.43 | 472.1 | 474.33 |
| 73.83785793975457 | 34.75 | -25.28 | 468.63 | 470.85 |
| 74.00520639642991 | 34.13 | -25.68 | 466.26 | 468.45 |
| 74.16325771662328 | 33.86 | -25.59 | 462.35 | 464.53 |
| 74.33060617329863 | 33.37 | -25.64 | 457.49 | 459.66 |
| 74.49795462997398 | 32.81 | -25.86 | 452.25 | 454.39 |
| 74.66530308664932 | 32.13 | -25.96 | 446.31 | 448.43 |
| 74.83265154332466 | 31.14 | -26.26 | 439.96 | 442.04 |
| 75.00000000000001 | 30.1 | -26.02 | 433.84 | 435.85 |
| 75.16734845667534 | 29.49 | -25.9 | 427.48 | 429.47 |
| 75.3346969133507 | 28.97 | -25.97 | 421.79 | 423.75 |
| 75.50204537002605 | 28.4 | -26.02 | 416.12 | 418.06 |
| 75.66939382670138 | 28.11 | -25.85 | 410.68 | 412.62 |
| 75.83674228337672 | 27.46 | -25.85 | 405.04 | 406.94 |
| 76.00409074005208 | 26.64 | -25.85 | 398.64 | 400.5 |
| 76.17143919672742 | 26.18 | -25.76 | 391.99 | 393.84 |
| 76.33878765340276 | 26.05 | -25.52 | 386.58 | 388.43 |
| 76.49683897359614 | 25.57 | -25.4 | 380.67 | 382.5 |
| 76.66418743027148 | 25.13 | -25.24 | 374.81 | 376.63 |
| 76.83153588694682 | 24.68 | -25.09 | 369.22 | 371.01 |
| 76.99888434362218 | 24.07 | -25 | 364.47 | 366.23 |
| 77.16623280029752 | 23.4 | -24.86 | 359.72 | 361.44 |
| 77.33358125697285 | 22.92 | -24.62 | 354.17 | 355.87 |
| 77.5009297136482 | 22.45 | -24.51 | 349.94 | 351.61 |
| 77.66827817032356 | 21.99 | -24.39 | 345.72 | 347.36 |
| 77.83562662699889 | 21.5 | -24.28 | 342.3 | 343.92 |
| 78.00297508367423 | 21.09 | -24.49 | 340.75 | 342.36 |
| 78.17032354034959 | 20.94 | -24.62 | 340.24 | 341.85 |
| 78.33767199702493 | 21.15 | -24.64 | 340.76 | 342.38 |
| 78.50502045370027 | 21.7 | -24.83 | 344.46 | 346.12 |
| 78.67236891037561 | 21.94 | -24.83 | 346.73 | 348.4 |
| 78.83042023056899 | 22.03 | -24.76 | 347.07 | 348.74 |
| 78.99776868724433 | 21.98 | -24.77 | 346.4 | 348.07 |
| 79.16511714391969 | 21.83 | -24.83 | 345.07 | 346.75 |
| 79.33246560059503 | 21.69 | -24.89 | 343.75 | 345.42 |
| 79.49981405727036 | 21.2 | -24.8 | 340.03 | 341.68 |
| 79.66716251394571 | 20.72 | -24.68 | 335.34 | 336.97 |
| 79.83451097062107 | 20.3 | -24.63 | 331.39 | 333.01 |
| 80.00185942729641 | 20.15 | -24.75 | 329.03 | 330.66 |
| 80.16920788397174 | 20.03 | -24.99 | 328.73 | 330.38 |
| 80.33655634064709 | 19.7 | -25 | 327.8 | 329.43 |
| 80.50390479732243 | 19.21 | -24.89 | 325.28 | 326.88 |
| 80.67125325399778 | 18.96 | -25.08 | 322.95 | 324.56 |
| 80.83860171067312 | 18.54 | -24.97 | 318.84 | 320.44 |
| 80.99665303086651 | 18.13 | -24.87 | 315 | 316.59 |
| 81.16400148754184 | 17.85 | -24.62 | 310.62 | 312.2 |
| 81.3313499442172 | 17.79 | -24.44 | 308.04 | 309.61 |
| 81.49869840089255 | 17.78 | -24.39 | 307.55 | 309.12 |
| 81.66604685756786 | 17.66 | -24.24 | 305.61 | 307.18 |
| 81.83339531424322 | 17.59 | -24.17 | 304.8 | 306.36 |
| 82.00074377091858 | 17.32 | -23.96 | 302.13 | 303.67 |
| 82.16809222759392 | 17 | -23.76 | 298.4 | 299.92 |
| 82.33544068426926 | 16.9 | -23.59 | 294.54 | 296.05 |
| 82.50278914094459 | 16.7 | -23.5 | 292.08 | 293.59 |
| 82.67013759761994 | 16.66 | -23.43 | 291.78 | 293.28 |
| 82.83748605429528 | 16.37 | -23.23 | 289.88 | 291.36 |
| 83.00483451097062 | 16.23 | -22.99 | 287.39 | 288.86 |
| 83.17218296764597 | 16.21 | -22.99 | 285.27 | 286.75 |
| 83.33023428783935 | 16.23 | -22.99 | 284.07 | 285.55 |
| 83.4975827445147 | 16.25 | -23.02 | 284.94 | 286.42 |
| 83.66493120119004 | 16.19 | -22.8 | 285.02 | 286.48 |
| 83.83227965786537 | 15.83 | -22.52 | 283.03 | 284.47 |
| 83.99962811454073 | 15.83 | -22.26 | 281.44 | 282.87 |
| 84.16697657121607 | 15.86 | -22.07 | 281.19 | 282.6 |
| 84.33432502789142 | 15.89 | -22 | 282.47 | 283.86 |
| 84.50167348456677 | 15.91 | -22.04 | 284.74 | 286.13 |
| 84.6690219412421 | 15.89 | -22.04 | 285.56 | 286.96 |
| 84.83637039791745 | 15.87 | -22.1 | 285.1 | 286.51 |
| 85.0037188545928 | 15.5 | -22.09 | 283.23 | 284.63 |
| 85.17106731126813 | 15.5 | -22.13 | 282.51 | 283.91 |
| 85.33841576794349 | 15.71 | -21.91 | 282.23 | 283.63 |
| 85.50576422461883 | 15.78 | -22.14 | 284.2 | 285.6 |
| 85.66381554481221 | 15.7 | -22.09 | 282.74 | 284.14 |
| 85.83116400148755 | 15.6 | -21.99 | 279.32 | 280.72 |
| 85.99851245816289 | 15.74 | -21.82 | 276.81 | 278.22 |
| 86.16586091483823 | 15.9 | -21.65 | 274.97 | 276.37 |
| 86.33320937151358 | 15.97 | -21.63 | 274.09 | 275.5 |
| 86.50055782818893 | 15.98 | -21.82 | 274.9 | 276.32 |
| 86.66790628486427 | 15.73 | -21.8 | 273.97 | 275.39 |
| 86.83525474153961 | 15.24 | -21.85 | 271.43 | 272.84 |
| 87.00260319821496 | 15.06 | -21.9 | 268.81 | 270.23 |
| 87.16995165489031 | 15.12 | -21.78 | 266.93 | 268.36 |
| 87.33730011156564 | 15.19 | -21.66 | 265.76 | 267.19 |
| 87.504648568241 | 15.01 | -21.8 | 266.46 | 267.89 |
| 87.67199702491634 | 14.83 | -21.82 | 267.06 | 268.47 |
| 87.83004834510972 | 14.68 | -21.8 | 267.47 | 268.88 |
| 87.99739680178506 | 14.66 | -21.89 | 265.78 | 267.21 |
| 88.1647452584604 | 14.59 | -21.97 | 263.12 | 264.57 |
| 88.33209371513574 | 14.61 | -22.1 | 261.28 | 262.74 |
| 88.49944217181108 | 14.93 | -22.03 | 261.81 | 263.27 |
| 88.66679062848644 | 14.97 | -22.13 | 263.41 | 264.88 |
| 88.83413908516178 | 14.65 | -22.24 | 263.59 | 265.06 |
| 89.00148754183712 | 14.3 | -22.14 | 260.36 | 261.82 |
| 89.16883599851246 | 14.4 | -22.05 | 258.02 | 259.49 |
| 89.33618445518782 | 14.52 | -22.16 | 258.6 | 260.08 |
| 89.50353291186315 | 14.45 | -22.25 | 260.7 | 262.18 |
| 89.6708813685385 | 14.07 | -22.22 | 261.71 | 263.16 |
| 89.83822982521386 | 13.6 | -22.03 | 260.54 | 261.97 |
| 90.00557828188919 | 13.35 | -22.15 | 259.17 | 260.6 |
| 90.16362960208257 | 13.21 | -22.36 | 258.18 | 259.63 |
| 90.3309780587579 | 13.58 | -22.34 | 260.35 | 261.8 |
| 90.49832651543326 | 13.59 | -22.4 | 262.72 | 264.17 |
| 90.66567497210859 | 13.34 | -22.42 | 263.54 | 264.98 |
| 90.83302342878395 | 13.21 | -22.21 | 262.42 | 263.84 |
| 91.00037188545929 | 13.14 | -22.06 | 261.13 | 262.54 |
| 91.16772034213463 | 12.85 | -22.05 | 259.51 | 260.92 |
| 91.33506879880998 | 12.7 | -22.07 | 259.12 | 260.52 |
| 91.50241725548533 | 12.75 | -22.02 | 259.16 | 260.55 |
| 91.66976571216065 | 12.89 | -22.18 | 261.41 | 262.81 |
| 91.83711416883601 | 12.85 | -22.43 | 263.27 | 264.68 |
| 92.00446262551137 | 12.52 | -22.5 | 263.04 | 264.47 |
| 92.1718110821867 | 12.41 | -22.33 | 261.34 | 262.77 |
| 92.33915953886203 | 12.55 | -22.19 | 260.58 | 262 |
| 92.49721085905541 | 13.04 | -22.06 | 261.49 | 262.9 |
| 92.66455931573077 | 13.3 | -22.03 | 262.92 | 264.33 |
| 92.83190777240611 | 13.09 | -21.93 | 261.75 | 263.15 |
| 92.99925622908145 | 12.77 | -22.12 | 259.61 | 261.02 |
| 93.1666046857568 | 12.95 | -21.91 | 258.54 | 259.93 |
| 93.33395314243214 | 13.08 | -21.78 | 259.63 | 261 |
| 93.50130159910749 | 13.26 | -21.63 | 261.8 | 263.17 |
| 93.66865005578283 | 13.06 | -21.93 | 262.68 | 264.06 |
| 93.83599851245818 | 12.76 | -21.76 | 261.36 | 262.73 |
| 94.00334696913353 | 12.59 | -21.92 | 259.79 | 261.17 |
| 94.17069542580886 | 12.79 | -21.82 | 258.76 | 260.15 |
| 94.3380438824842 | 13 | -21.75 | 259.7 | 261.07 |
| 94.50539233915954 | 13.18 | -21.54 | 262.09 | 263.45 |
| 94.66344365935292 | 12.96 | -21.77 | 262.6 | 263.97 |
| 94.83079211602828 | 12.83 | -21.73 | 260.68 | 262.06 |
| 94.99814057270362 | 12.93 | -21.77 | 259.36 | 260.75 |
| 95.16548902937897 | 13.25 | -21.77 | 261.05 | 262.46 |
| 95.33283748605432 | 12.99 | -21.96 | 262.56 | 263.95 |
| 95.50018594272963 | 12.59 | -22 | 262.26 | 263.64 |
| 95.66753439940499 | 12.12 | -22.09 | 260.27 | 261.65 |
| 95.83488285608034 | 11.88 | -22.25 | 259 | 260.38 |
| 96.00223131275567 | 12.09 | -22.18 | 259.53 | 260.92 |
| 96.16957976943102 | 12.12 | -22.23 | 261.34 | 262.73 |
| 96.33692822610638 | 12 | -22.32 | 262.01 | 263.4 |
| 96.50427668278171 | 11.81 | -22.41 | 260.06 | 261.46 |
| 96.67162513945706 | 11.73 | -22.31 | 257.26 | 258.67 |
| 96.8389735961324 | 11.94 | -22.46 | 256.82 | 258.25 |
| 96.99702491632577 | 12.12 | -22.51 | 259.37 | 260.79 |
| 97.16437337300111 | 12.08 | -22.52 | 260.47 | 261.89 |
| 97.33172182967647 | 11.97 | -22.57 | 260.26 | 261.68 |
| 97.49907028635181 | 11.68 | -22.62 | 259.68 | 261.11 |
| 97.66641874302715 | 11.64 | -22.48 | 258.22 | 259.64 |
| 97.8337671997025 | 12.06 | -22.33 | 260.11 | 261.52 |
| 98.00111565637785 | 12.42 | -22.25 | 262.93 | 264.33 |
| 98.16846411305319 | 12.32 | -22.36 | 263.69 | 265.08 |
| 98.33581256972855 | 12.02 | -22.35 | 262.75 | 264.14 |
| 98.50316102640389 | 12.08 | -22.27 | 262.39 | 263.78 |
| 98.67050948307921 | 12.27 | -22.19 | 263.3 | 264.68 |
| 98.83785793975456 | 12.48 | -22.12 | 265.71 | 267.08 |
| 99.0052063964299 | 12.54 | -22.34 | 269.05 | 270.42 |
| 99.17255485310525 | 12.53 | -22.48 | 270.55 | 271.93 |
| 99.33060617329863 | 12.51 | -22.46 | 270.24 | 271.63 |
| 99.49795462997399 | 12.41 | -22.32 | 268.01 | 269.4 |
| 99.66530308664933 | 12.57 | -22.28 | 268.15 | 269.53 |
| 99.83265154332467 | 12.58 | -22.29 | 268.03 | 269.41 |
| 100.0 | 12.75 | -22.07 | 266.69 | 268.07 |